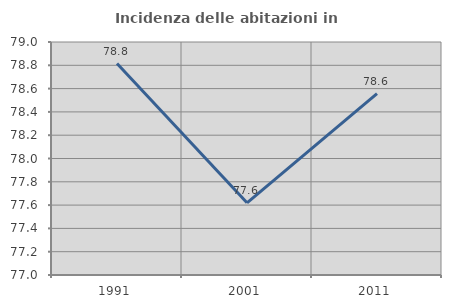
| Category | Incidenza delle abitazioni in proprietà  |
|---|---|
| 1991.0 | 78.815 |
| 2001.0 | 77.619 |
| 2011.0 | 78.558 |